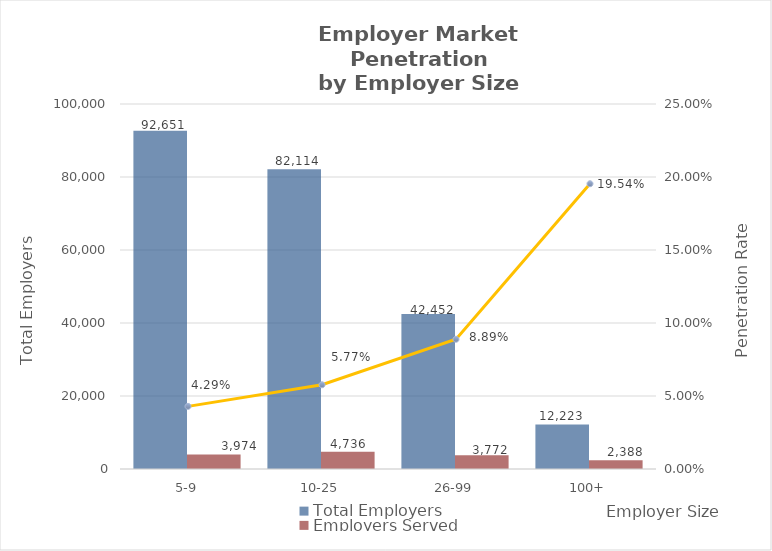
| Category | Total Employers | Employers Served |
|---|---|---|
| 5-9 | 92651 | 3974 |
| 10-25 | 82114 | 4736 |
| 26-99 | 42452 | 3772 |
| 100+ | 12223 | 2388 |